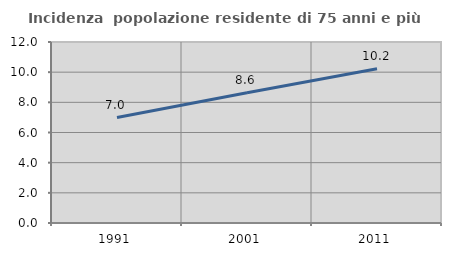
| Category | Incidenza  popolazione residente di 75 anni e più |
|---|---|
| 1991.0 | 6.99 |
| 2001.0 | 8.631 |
| 2011.0 | 10.224 |